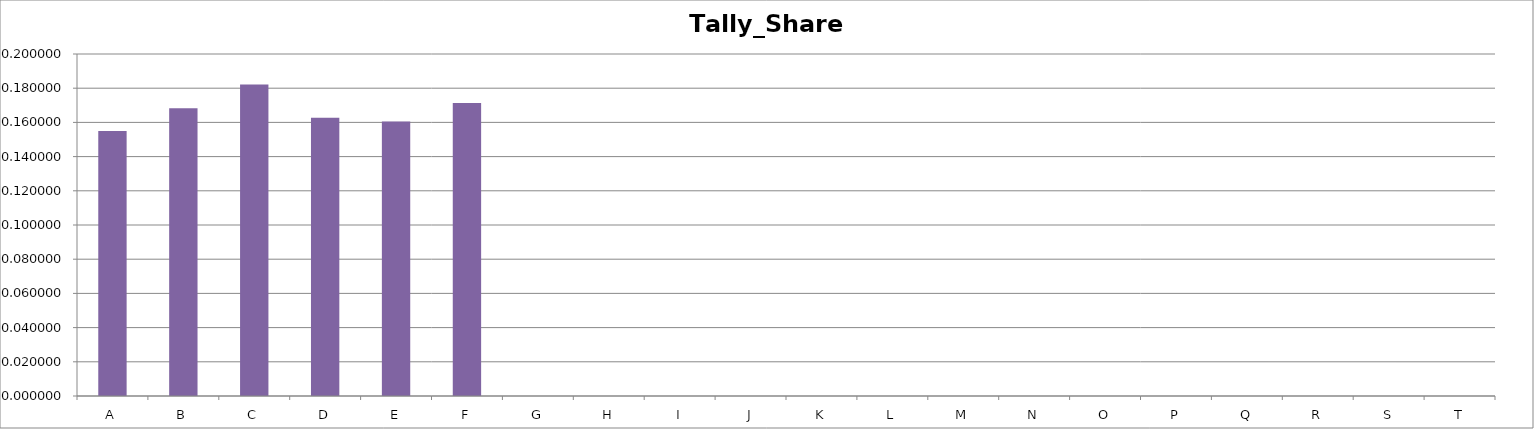
| Category | Series 0 |
|---|---|
| 0 | 0.155 |
| 1 | 0.168 |
| 2 | 0.182 |
| 3 | 0.163 |
| 4 | 0.161 |
| 5 | 0.171 |
| 6 | 0 |
| 7 | 0 |
| 8 | 0 |
| 9 | 0 |
| 10 | 0 |
| 11 | 0 |
| 12 | 0 |
| 13 | 0 |
| 14 | 0 |
| 15 | 0 |
| 16 | 0 |
| 17 | 0 |
| 18 | 0 |
| 19 | 0 |